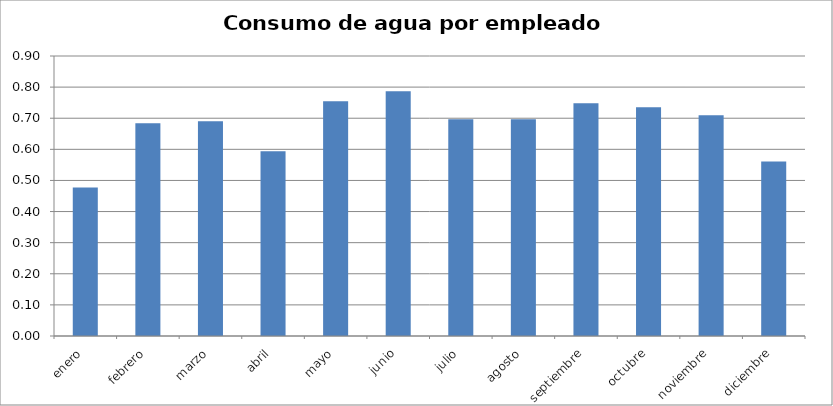
| Category | Series 0 |
|---|---|
| enero | 0.477 |
| febrero | 0.684 |
| marzo | 0.69 |
| abril | 0.594 |
| mayo | 0.755 |
| junio | 0.787 |
| julio | 0.697 |
| agosto | 0.697 |
| septiembre | 0.748 |
| octubre | 0.735 |
| noviembre | 0.71 |
| diciembre | 0.561 |